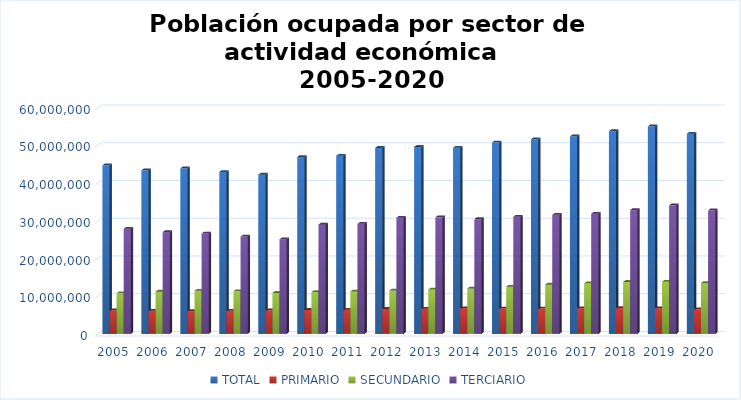
| Category | TOTAL | PRIMARIO | SECUNDARIO | TERCIARIO |
|---|---|---|---|---|
| 2005.0 | 44651832 | 6219011.25 | 10760545.25 | 27860436 |
| 2006.0 | 43344281 | 6126667.5 | 11191300 | 26969855 |
| 2007.0 | 43866696 | 6044910 | 11417699.75 | 26594105 |
| 2008.0 | 42906656 | 6113602.5 | 11297480 | 25788672 |
| 2009.0 | 42197775 | 6217293.25 | 10858863.5 | 25051946 |
| 2010.0 | 46890584 | 6365815 | 11054568.75 | 28955172 |
| 2011.0 | 47182447 | 6394483.25 | 11236999 | 29163787 |
| 2012.0 | 49280265 | 6622947 | 11489001.5 | 30783952 |
| 2013.0 | 49549331 | 6665525.75 | 11743497.25 | 30883639 |
| 2014.0 | 49305839 | 6750548.25 | 12026365 | 30420552 |
| 2015.0 | 50734656 | 6743944.75 | 12503693.5 | 31034063 |
| 2016.0 | 51594748.25 | 6710256.5 | 13056794.75 | 31552075.25 |
| 2017.0 | 52340749.25 | 6811268.5 | 13377073.25 | 31846972.75 |
| 2018.0 | 53721194.5 | 6826479.75 | 13773605 | 32807468.75 |
| 2019.0 | 54993593.5 | 6809839 | 13807686.75 | 34065901 |
| 2020.0 | 53033793.375 | 6528663.75 | 13449953.375 | 32753125.625 |